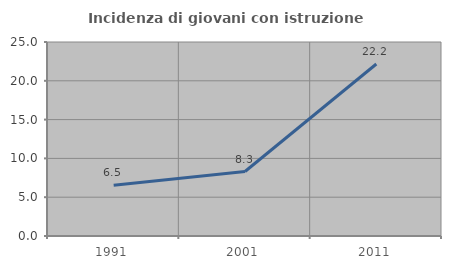
| Category | Incidenza di giovani con istruzione universitaria |
|---|---|
| 1991.0 | 6.542 |
| 2001.0 | 8.309 |
| 2011.0 | 22.164 |